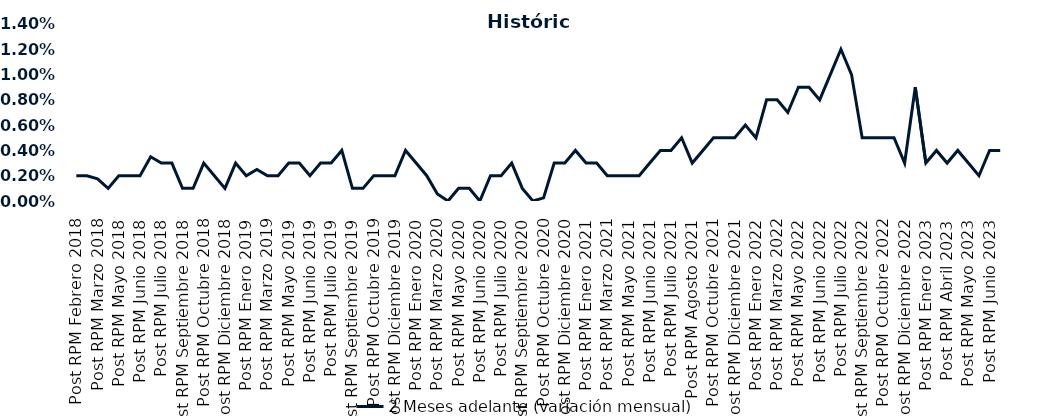
| Category | 2 Meses adelante (variación mensual) |
|---|---|
| Post RPM Febrero 2018 | 0.002 |
| Pre RPM Marzo 2018 | 0.002 |
| Post RPM Marzo 2018 | 0.002 |
| Pre RPM Mayo 2018 | 0.001 |
| Post RPM Mayo 2018 | 0.002 |
| Pre RPM Junio 2018 | 0.002 |
| Post RPM Junio 2018 | 0.002 |
| Pre RPM Julio 2018 | 0.004 |
| Post RPM Julio 2018 | 0.003 |
| Pre RPM Septiembre 2018 | 0.003 |
| Post RPM Septiembre 2018 | 0.001 |
| Pre RPM Octubre 2018 | 0.001 |
| Post RPM Octubre 2018 | 0.003 |
| Pre RPM Diciembre 2018 | 0.002 |
| Post RPM Diciembre 2018 | 0.001 |
| Pre RPM Enero 2019 | 0.003 |
| Post RPM Enero 2019 | 0.002 |
| Pre RPM Marzo 2019 | 0.002 |
| Post RPM Marzo 2019 | 0.002 |
| Pre RPM Mayo 2019 | 0.002 |
| Post RPM Mayo 2019 | 0.003 |
| Pre RPM Junio 2019 | 0.003 |
| Post RPM Junio 2019 | 0.002 |
| Pre RPM Julio 2019 | 0.003 |
| Post RPM Julio 2019 | 0.003 |
| Pre RPM Septiembre 2019 | 0.004 |
| Post RPM Septiembre 2019 | 0.001 |
| Pre RPM Octubre 2019 | 0.001 |
| Post RPM Octubre 2019 | 0.002 |
| Pre RPM Diciembre 2019 | 0.002 |
| Post RPM Diciembre 2019 | 0.002 |
| Pre RPM Enero 2020 | 0.004 |
| Post RPM Enero 2020 | 0.003 |
| Pre RPM Marzo 2020 | 0.002 |
| Post RPM Marzo 2020 | 0.001 |
| Pre RPM Mayo 2020 | 0 |
| Post RPM Mayo 2020 | 0.001 |
| Pre RPM Junio 2020 | 0.001 |
| Post RPM Junio 2020 | 0 |
| Pre RPM Julio 2020 | 0.002 |
| Post RPM Julio 2020 | 0.002 |
| Pre RPM Septiembre 2020 | 0.003 |
| Post RPM Septiembre 2020 | 0.001 |
| Pre RPM Octubre 2020 | 0 |
| Post RPM Octubre 2020 | 0 |
| Pre RPM Diciembre 2020 | 0.003 |
| Post RPM Diciembre 2020 | 0.003 |
| Pre RPM Enero 2021 | 0.004 |
| Post RPM Enero 2021 | 0.003 |
| Pre RPM Marzo 2021 | 0.003 |
| Post RPM Marzo 2021 | 0.002 |
| Pre RPM Mayo 2021 | 0.002 |
| Post RPM Mayo 2021 | 0.002 |
| Pre RPM Junio 2021 | 0.002 |
| Post RPM Junio 2021 | 0.003 |
| Pre RPM Julio 2021 | 0.004 |
| Post RPM Julio 2021 | 0.004 |
| Pre RPM Agosto 2021 | 0.005 |
| Post RPM Agosto 2021 | 0.003 |
| Pre RPM Octubre 2021 | 0.004 |
| Post RPM Octubre 2021 | 0.005 |
| Pre RPM Diciembre 2021 | 0.005 |
| Post RPM Diciembre 2021 | 0.005 |
| Pre RPM Enero 2022 | 0.006 |
| Post RPM Enero 2022 | 0.005 |
| Pre RPM Marzo 2022 | 0.008 |
| Post RPM Marzo 2022 | 0.008 |
| Pre RPM Mayo 2022 | 0.007 |
| Post RPM Mayo 2022 | 0.009 |
| Pre RPM Junio 2022 | 0.009 |
| Post RPM Junio 2022 | 0.008 |
| Pre RPM Julio 2022 | 0.01 |
| Post RPM Julio 2022 | 0.012 |
| Pre RPM Septiembre 2022 | 0.01 |
| Post RPM Septiembre 2022 | 0.005 |
| Pre RPM Octubre 2022 | 0.005 |
| Post RPM Octubre 2022 | 0.005 |
| Pre RPM Diciembre 2022 | 0.005 |
| Post RPM Diciembre 2022 | 0.003 |
| Pre RPM Enero 2023 | 0.009 |
| Post RPM Enero 2023 | 0.003 |
| Pre RPM Abril 2023 | 0.004 |
| Post RPM Abril 2023 | 0.003 |
| Pre RPM Mayo 2023 | 0.004 |
| Post RPM Mayo 2023 | 0.003 |
| Pre RPM Junio 2023 | 0.002 |
| Post RPM Junio 2023 | 0.004 |
| Pre RPM Julio 2023 | 0.004 |